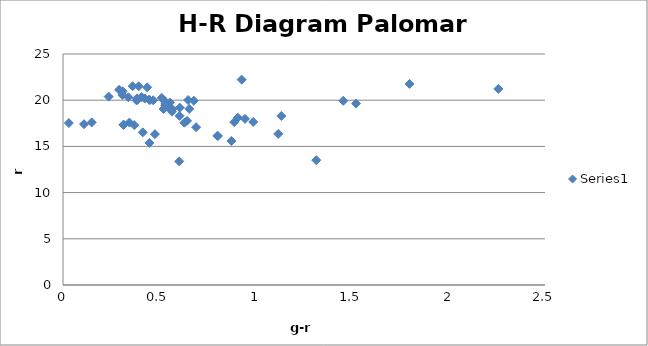
| Category | Series 0 |
|---|---|
| 0.14884999999999948 | 17.594 |
| 0.6052339999999994 | 19.194 |
| 0.10898199999999747 | 17.403 |
| 0.3442709999999991 | 17.579 |
| 0.314508 | 17.36 |
| 0.23674700000000115 | 20.388 |
| 0.6027470000000008 | 13.377 |
| 0.8737180000000002 | 15.588 |
| 0.8030019999999993 | 16.12 |
| 0.6904560000000011 | 17.079 |
| 0.3137359999999987 | 17.319 |
| 0.030241000000000184 | 17.528 |
| 0.36958299999999866 | 17.307 |
| 0.6435410000000026 | 17.766 |
| 1.520029000000001 | 19.638 |
| 0.5664669999999994 | 19.04 |
| 0.5306509999999989 | 19.419 |
| 1.453907000000001 | 19.935 |
| 0.5542760000000015 | 19.754 |
| 0.5265699999999995 | 19.937 |
| 0.4680889999999991 | 19.995 |
| 0.4500160000000015 | 20.012 |
| 0.38202099999999817 | 19.976 |
| 1.7975309999999993 | 21.763 |
| 0.42429699999999926 | 20.181 |
| 0.38358500000000006 | 20.191 |
| 0.5120639999999987 | 20.256 |
| 0.4081229999999998 | 20.342 |
| 0.30796899999999994 | 20.555 |
| 0.4484630000000003 | 15.383 |
| 0.8013060000000003 | 16.152 |
| 0.5655269999999994 | 18.762 |
| 0.5307720000000025 | 19.598 |
| 0.4456780000000009 | 20.063 |
| 0.5214609999999986 | 19.048 |
| 0.5492090000000012 | 19.198 |
| 0.3613029999999995 | 21.513 |
| 0.3390960000000014 | 20.31 |
| 0.6045410000000011 | 18.307 |
| 0.6294920000000026 | 17.569 |
| 1.1323240000000006 | 18.294 |
| 0.30925200000000075 | 20.965 |
| 1.1165590000000023 | 16.351 |
| 0.3883340000000004 | 20.108 |
| 0.3923780000000008 | 21.508 |
| 0.2910219999999981 | 21.124 |
| 0.4368819999999971 | 21.39 |
| 0.4767969999999977 | 16.325 |
| 1.3138460000000016 | 13.511 |
| 0.8880139999999983 | 17.627 |
| 0.9066100000000006 | 18.107 |
| 0.654947 | 19.061 |
| 0.6490039999999979 | 20.012 |
| 2.2580659999999995 | 21.222 |
| 0.9266219999999983 | 22.224 |
| 0.4137570000000004 | 16.525 |
| 0.9867290000000004 | 17.644 |
| 0.943874000000001 | 17.979 |
| 0.678484000000001 | 19.939 |